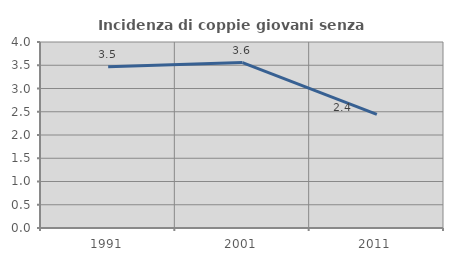
| Category | Incidenza di coppie giovani senza figli |
|---|---|
| 1991.0 | 3.468 |
| 2001.0 | 3.557 |
| 2011.0 | 2.445 |